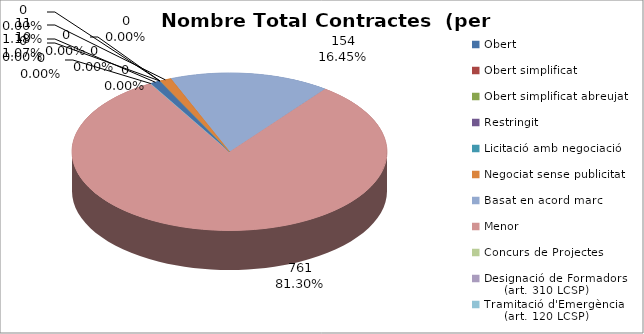
| Category | Nombre Total Contractes |
|---|---|
| Obert | 10 |
| Obert simplificat | 0 |
| Obert simplificat abreujat | 0 |
| Restringit | 0 |
| Licitació amb negociació | 0 |
| Negociat sense publicitat | 11 |
| Basat en acord marc | 154 |
| Menor | 761 |
| Concurs de Projectes | 0 |
| Designació de Formadors
     (art. 310 LCSP) | 0 |
| Tramitació d'Emergència
     (art. 120 LCSP) | 0 |